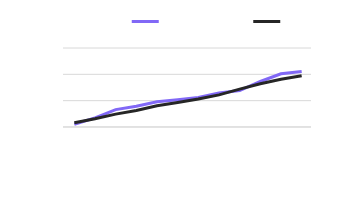
| Category | Current Year | Target |
|---|---|---|
| January | 105103 | 160000 |
| February | 348374 | 315000 |
| March | 660832 | 490000 |
| April | 790533 | 630000 |
| May | 956819 | 805000 |
| June | 1033532 | 930000 |
| July | 1124028 | 1060000 |
| August | 1291467 | 1220000 |
| September | 1381856 | 1440000 |
| October | 1728948 | 1640000 |
| November | 2022080 | 1810000 |
| December | 2111024 | 1950000 |